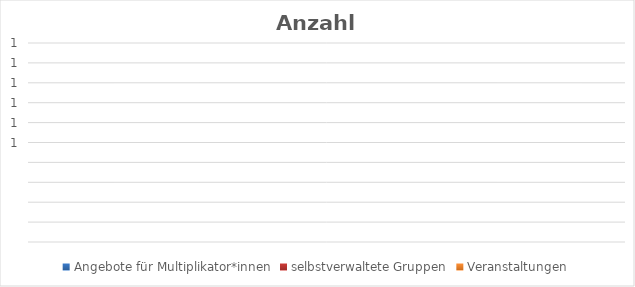
| Category | Angebote für Multiplikator*innen | selbstverwaltete Gruppen | Veranstaltungen |
|---|---|---|---|
| 0 | 0 | 0 | 0 |